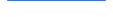
| Category | Series 0 |
|---|---|
| 0 | 787.525 |
| 1 | 708.459 |
| 2 | 714.074 |
| 3 | 630.878 |
| 4 | 629.672 |
| 5 | 598.333 |
| 6 | 569 |
| 7 | 570 |
| 8 | 585 |